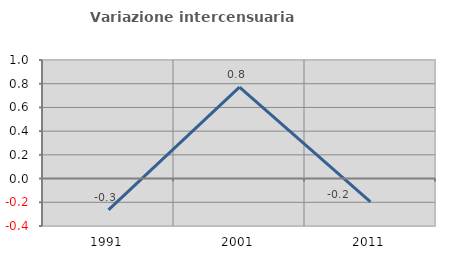
| Category | Variazione intercensuaria annua |
|---|---|
| 1991.0 | -0.263 |
| 2001.0 | 0.771 |
| 2011.0 | -0.196 |